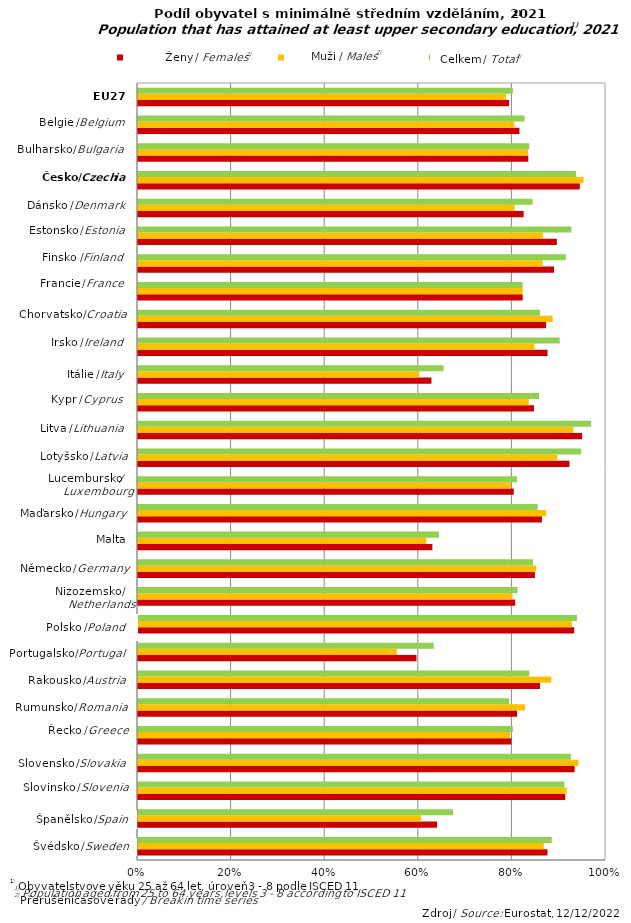
| Category | Celkem / Total | Muži / Males | Ženy / Females |
|---|---|---|---|
| Sweden | 0.875 | 0.867 | 0.884 |
| Spain | 0.639 | 0.605 | 0.673 |
| Slovenia | 0.913 | 0.916 | 0.911 |
| Slovakia | 0.933 | 0.941 | 0.925 |
| Greece | 0.798 | 0.795 | 0.801 |
| Romania | 0.81 | 0.827 | 0.793 |
| Austria | 0.859 | 0.883 | 0.836 |
| Portugal | 0.595 | 0.553 | 0.632 |
| Poland | 0.932 | 0.927 | 0.938 |
| Netherlands | 0.806 | 0.8 | 0.811 |
| Germany | 0.848 | 0.851 | 0.844 |
| Malta | 0.629 | 0.616 | 0.643 |
| Hungary | 0.863 | 0.872 | 0.854 |
| Luxembourg | 0.803 | 0.797 | 0.81 |
| Latvia | 0.922 | 0.896 | 0.947 |
| Lithuania | 0.949 | 0.93 | 0.968 |
| Cyprus | 0.846 | 0.835 | 0.857 |
| Italy | 0.627 | 0.601 | 0.653 |
| Ireland | 0.875 | 0.847 | 0.901 |
| Croatia | 0.872 | 0.886 | 0.859 |
| France | 0.822 | 0.822 | 0.822 |
| Finland | 0.889 | 0.865 | 0.914 |
| Estonia | 0.895 | 0.865 | 0.926 |
| Denmark | 0.824 | 0.805 | 0.843 |
| Czechia | 0.944 | 0.952 | 0.936 |
| Bulgaria | 0.834 | 0.833 | 0.836 |
| Belgium | 0.815 | 0.804 | 0.826 |
| EU 27 | 0.793 | 0.786 | 0.801 |